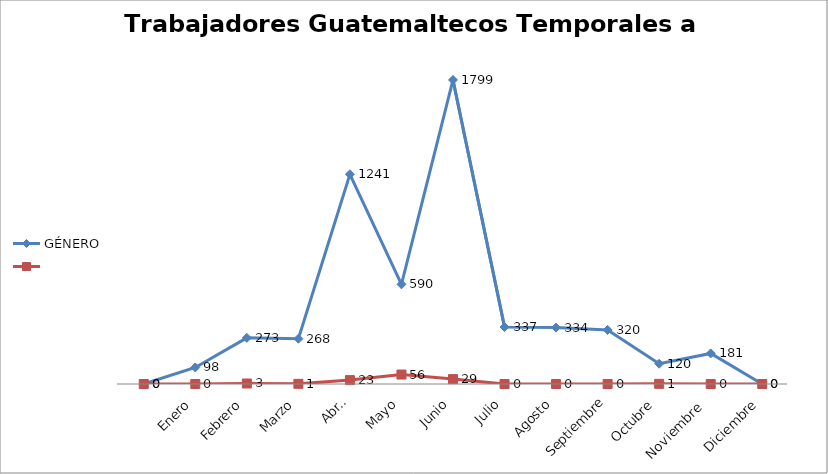
| Category | GÉNERO | Series 1 |
|---|---|---|
|  | 0 | 0 |
| Enero | 98 | 0 |
| Febrero | 273 | 3 |
| Marzo | 268 | 1 |
| Abril | 1241 | 23 |
| Mayo | 590 | 56 |
| Junio | 1799 | 29 |
| Julio | 337 | 0 |
| Agosto | 334 | 0 |
| Septiembre | 320 | 0 |
| Octubre | 120 | 1 |
| Noviembre  | 181 | 0 |
| Diciembre | 0 | 0 |